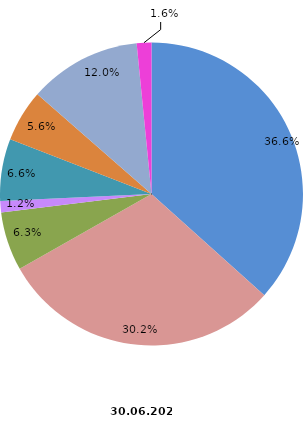
| Category | Anzahl Beschäftigte 2022 |
|---|---|
| Elektroinstallation | 5681 |
| Gas-, Wasser-, Heizungs- sowie Lüftungs- und Klimainstallation | 4675 |
| Sonstige Bauinstallation | 971 |
| Anbringen von Stuckaturen, Gipserei und Verputzerei | 187 |
| Bautischlerei und -schlosserei | 1026 |
| Fußboden-, Fliesen- und Plattenlegerei, Tapeziererei | 861 |
| Malerei und Glaserei | 1861 |
| Sonstiger Ausbau a. n. g. | 243 |